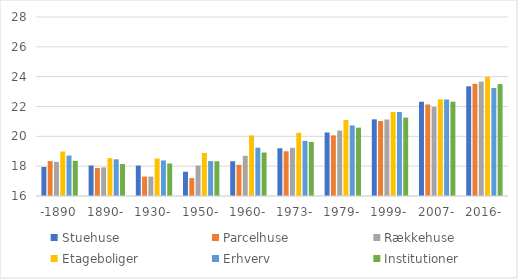
| Category | Stuehuse | Parcelhuse | Rækkehuse | Etageboliger | Erhverv | Institutioner |
|---|---|---|---|---|---|---|
| -1890 | 17.948 | 18.337 | 18.287 | 18.982 | 18.71 | 18.357 |
| 1890- | 18.045 | 17.878 | 17.918 | 18.54 | 18.46 | 18.144 |
| 1930- | 18.042 | 17.301 | 17.299 | 18.51 | 18.384 | 18.177 |
| 1950- | 17.624 | 17.201 | 18.043 | 18.883 | 18.34 | 18.332 |
| 1960- | 18.329 | 18.087 | 18.693 | 20.06 | 19.239 | 18.915 |
| 1973- | 19.198 | 18.998 | 19.231 | 20.238 | 19.697 | 19.621 |
| 1979- | 20.258 | 20.062 | 20.386 | 21.097 | 20.73 | 20.584 |
| 1999- | 21.14 | 21.024 | 21.127 | 21.632 | 21.63 | 21.254 |
| 2007- | 22.319 | 22.136 | 21.974 | 22.482 | 22.471 | 22.326 |
| 2016- | 23.353 | 23.518 | 23.67 | 23.988 | 23.241 | 23.502 |